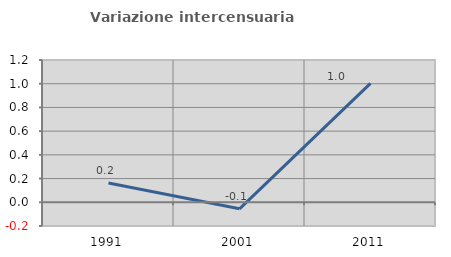
| Category | Variazione intercensuaria annua |
|---|---|
| 1991.0 | 0.163 |
| 2001.0 | -0.055 |
| 2011.0 | 1.003 |